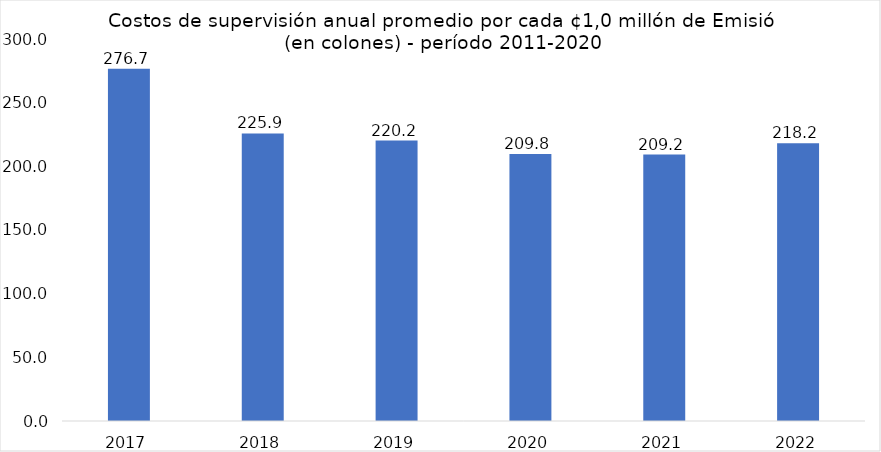
| Category | Costos de supervisión anual promedio por cada ¢1,0 millón de Emisión Registrada (en colones) |
|---|---|
| 2017.0 | 276.669 |
| 2018.0 | 225.868 |
| 2019.0 | 220.246 |
| 2020.0 | 209.778 |
| 2021.0 | 209.2 |
| 2022.0 | 218.207 |